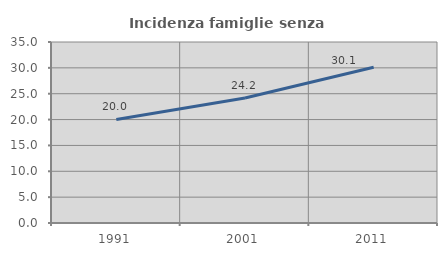
| Category | Incidenza famiglie senza nuclei |
|---|---|
| 1991.0 | 20.019 |
| 2001.0 | 24.184 |
| 2011.0 | 30.109 |